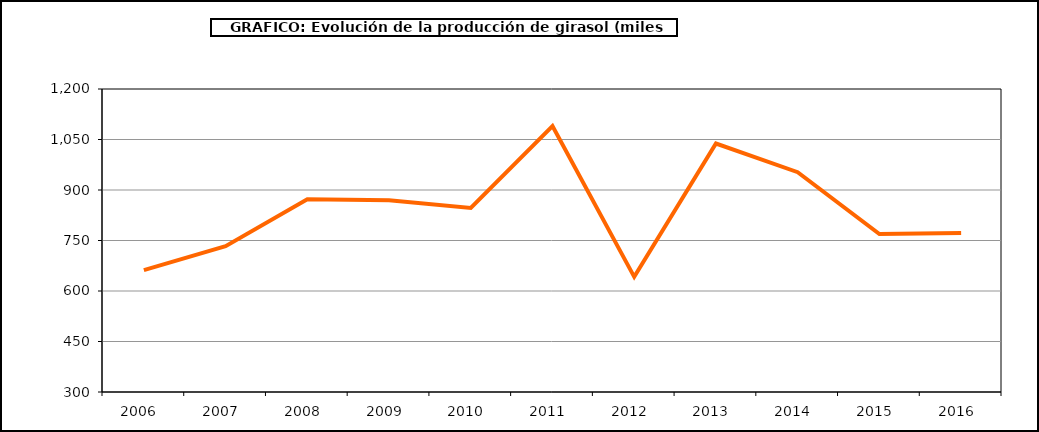
| Category | Producción |
|---|---|
| 2006.0 | 662.083 |
| 2007.0 | 733.154 |
| 2008.0 | 872.687 |
| 2009.0 | 869.54 |
| 2010.0 | 846.648 |
| 2011.0 | 1090.171 |
| 2012.0 | 642.017 |
| 2013.0 | 1038.071 |
| 2014.0 | 952.986 |
| 2015.0 | 769.195 |
| 2016.0 | 772.18 |